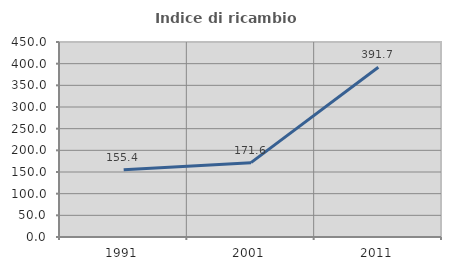
| Category | Indice di ricambio occupazionale  |
|---|---|
| 1991.0 | 155.372 |
| 2001.0 | 171.56 |
| 2011.0 | 391.667 |